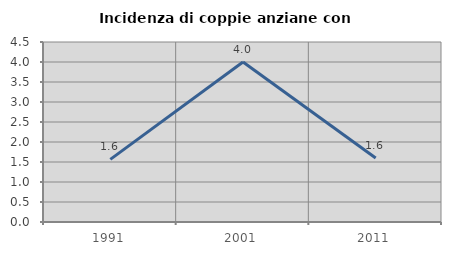
| Category | Incidenza di coppie anziane con figli |
|---|---|
| 1991.0 | 1.566 |
| 2001.0 | 4 |
| 2011.0 | 1.6 |